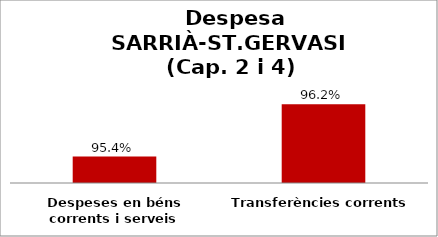
| Category | Series 0 |
|---|---|
| Despeses en béns corrents i serveis | 0.954 |
| Transferències corrents | 0.962 |